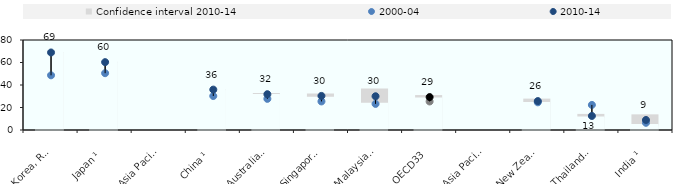
| Category | Confidence interval 2010-14 | Lower band |
|---|---|---|
| Korea, Rep.  | 69.2 | 68.6 |
| Japan ¹ | 60.7 | 59.9 |
| Asia Pacific-H | 44.62 | 42.18 |
| China ¹ | 36.5 | 35.3 |
| Australia   | 32.9 | 30.7 |
| Singapore  | 32.4 | 28.2 |
| Malaysia ¹ | 37 | 22.9 |
| OECD33 | 31.055 | 27.488 |
| Asia Pacific-UM | 29.267 | 22.967 |
| New Zealand  | 27.9 | 23.5 |
| Thailand ¹ ² | 14.3 | 10.7 |
| India ¹ | 13.9 | 4 |